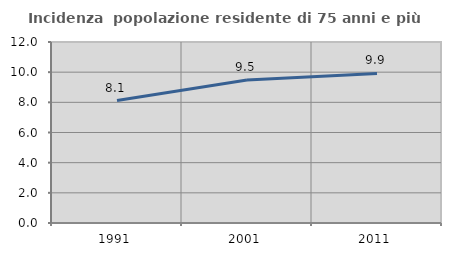
| Category | Incidenza  popolazione residente di 75 anni e più |
|---|---|
| 1991.0 | 8.115 |
| 2001.0 | 9.481 |
| 2011.0 | 9.914 |